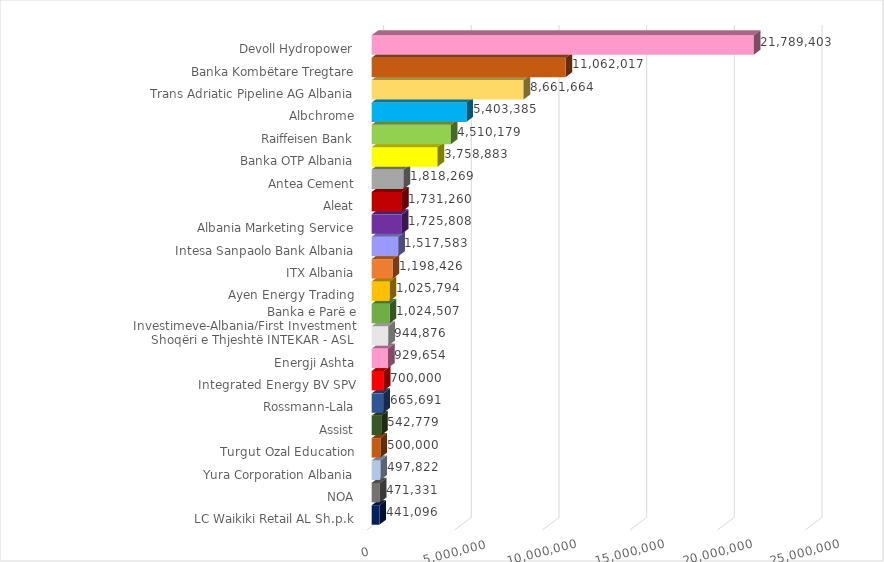
| Category | Fitim Operativ 2022 (në Lekë) |
|---|---|
| LC Waikiki Retail AL Sh.p.k | 441096.448 |
| NOA | 471331 |
| Yura Corporation Albania | 497821.742 |
| Turgut Ozal Education | 500000 |
| Assist | 542778.86 |
| Rossmann-Lala | 665690.965 |
| Integrated Energy BV SPV | 700000 |
| Energji Ashta | 929653.643 |
| Shoqëri e Thjeshtë INTEKAR - ASL | 944876.3 |
| Banka e Parë e Investimeve-Albania/First Investment Bank Albania | 1024507 |
| Ayen Energy Trading | 1025794.297 |
| ITX Albania | 1198426 |
| Intesa Sanpaolo Bank Albania | 1517583 |
| Albania Marketing Service | 1725808.306 |
| Aleat | 1731259.875 |
| Antea Cement | 1818269 |
| Banka OTP Albania | 3758883 |
| Raiffeisen Bank | 4510179 |
| Albchrome | 5403385 |
| Trans Adriatic Pipeline AG Albania | 8661664 |
| Banka Kombëtare Tregtare | 11062017 |
| Devoll Hydropower | 21789403.253 |